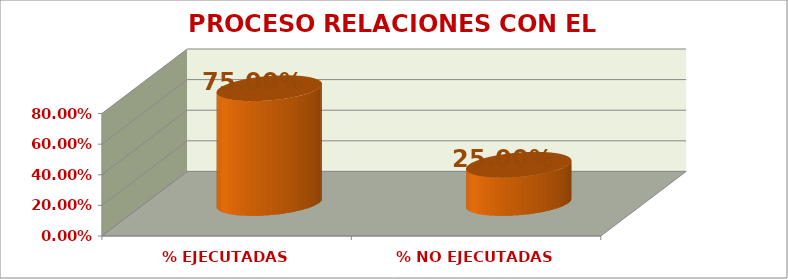
| Category | PROCESO RELACIONES CON EL ENTORNO |
|---|---|
| % EJECUTADAS | 0.75 |
| % NO EJECUTADAS | 0.25 |